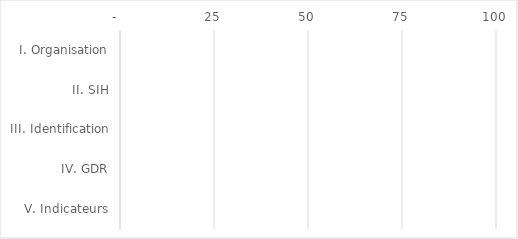
| Category | Series 0 |
|---|---|
| I. Organisation | 0 |
| II. SIH | 0 |
| III. Identification | 0 |
| IV. GDR | 0 |
| V. Indicateurs | 0 |